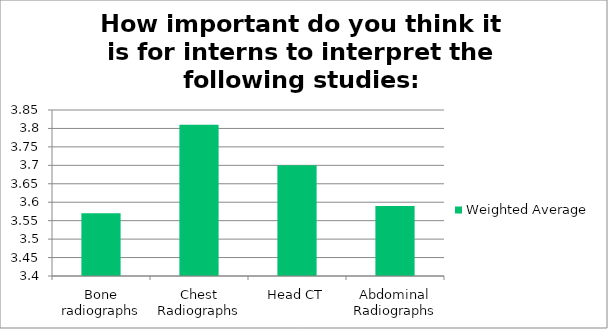
| Category | Weighted Average |
|---|---|
| Bone radiographs | 3.57 |
| Chest Radiographs | 3.81 |
| Head CT | 3.7 |
| Abdominal Radiographs | 3.59 |